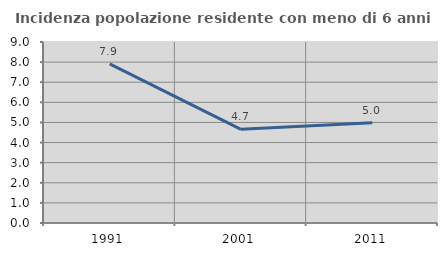
| Category | Incidenza popolazione residente con meno di 6 anni |
|---|---|
| 1991.0 | 7.916 |
| 2001.0 | 4.658 |
| 2011.0 | 4.99 |